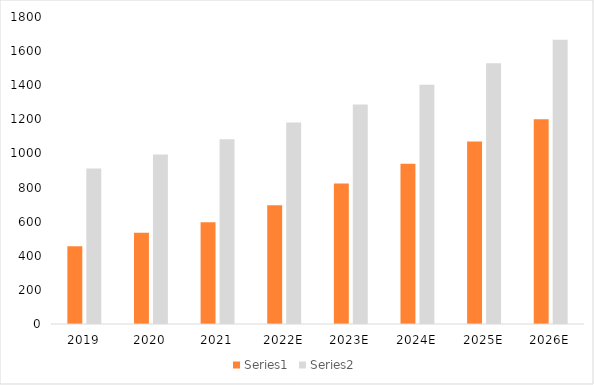
| Category | Series 0 | Series 1 |
|---|---|---|
| 2019 | 455.95 | 911.9 |
| 2020 | 534.756 | 993.971 |
| 2021 | 595.886 | 1083.428 |
| 2022E | 696.753 | 1180.937 |
| 2023E | 823.822 | 1287.221 |
| 2024E | 940.058 | 1403.071 |
| 2025E | 1070.543 | 1529.348 |
| 2026E | 1200.232 | 1666.989 |